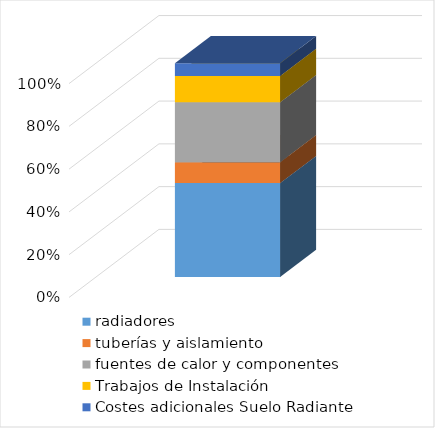
| Category | radiadores | tuberías y aislamiento | fuentes de calor y componentes | Trabajos de Instalación | Costes adicionales Suelo Radiante |
|---|---|---|---|---|---|
| otros | 3239.75 | 722 | 2070 | 904.762 | 440 |